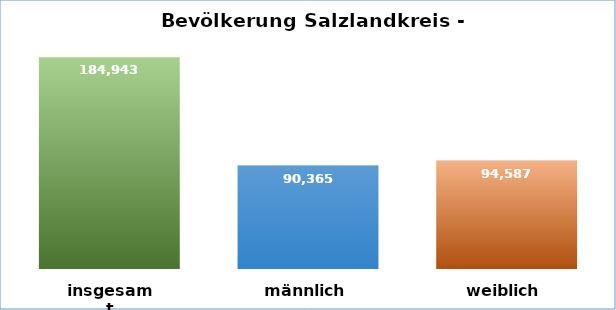
| Category | Series 0 |
|---|---|
| insgesamt | 184943 |
| männlich | 90365 |
| weiblich | 94587 |